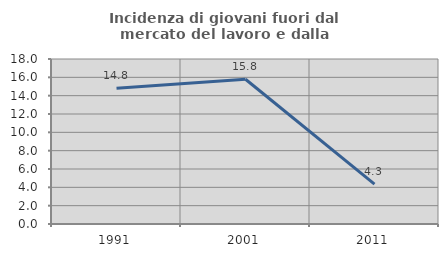
| Category | Incidenza di giovani fuori dal mercato del lavoro e dalla formazione  |
|---|---|
| 1991.0 | 14.815 |
| 2001.0 | 15.789 |
| 2011.0 | 4.348 |